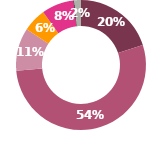
| Category | Series 0 |
|---|---|
| 0 | 40500 |
| 1 | 108500 |
| 2 | 21600 |
| 3 | 11900 |
| 4 | 16200 |
| 5 | 400 |
| 6 | 3400 |